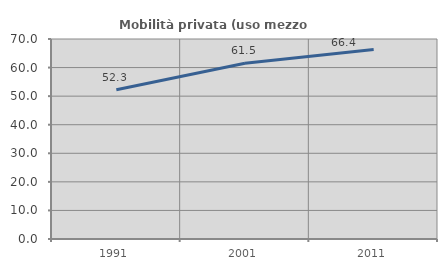
| Category | Mobilità privata (uso mezzo privato) |
|---|---|
| 1991.0 | 52.27 |
| 2001.0 | 61.538 |
| 2011.0 | 66.351 |